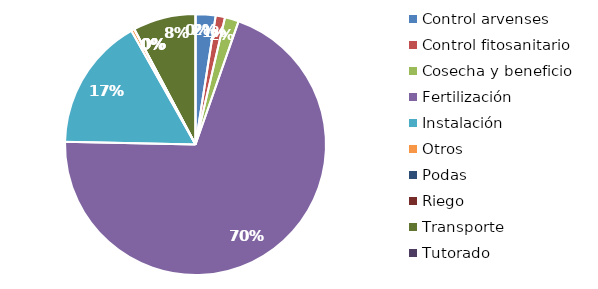
| Category | Valor |
|---|---|
| Control arvenses | 681576 |
| Control fitosanitario | 318498 |
| Cosecha y beneficio | 474109.554 |
| Fertilización | 19278560 |
| Instalación | 4539001.987 |
| Otros | 112883 |
| Podas | 0 |
| Riego | 0 |
| Transporte | 2140268 |
| Tutorado | 0 |